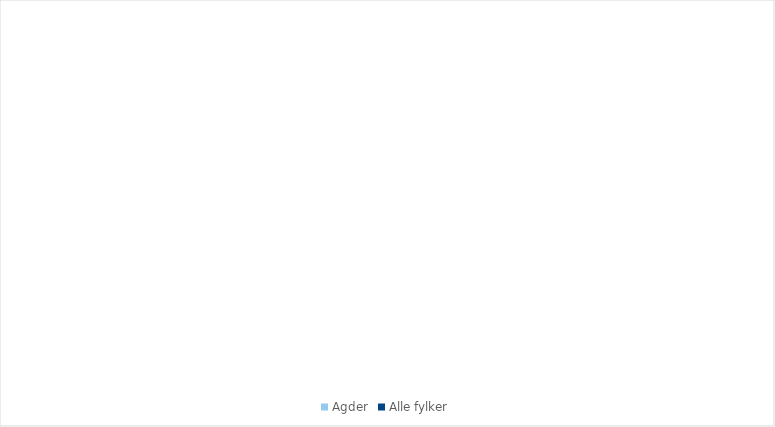
| Category | Agder | Alle fylker |
|---|---|---|
| 1.1 Landbruk | 0.694 | 0.814 |
| 1.2 Fiske/oppdrett | 0 | 1.732 |
| 2.1 Primærforedlingsindustri | 2.073 | 2.443 |
| 2.2 Olje/gass, bergverk | 0 | 2.052 |
| 2.3 Teknologiindustri | 3.727 | 1.926 |
| 2.4 Annen industri | 6.972 | 3.764 |
| 3.1 Bygg/anlegg, energi, vann/
avløp, eiendom | 25.052 | 21.135 |
| 3.2 Transport- og distribusjonstjenester | 4.618 | 4.233 |
| 4.1 Kunnskapsintensiv forretningsmessig tjenesteyting (KIFT) | 10.302 | 16.953 |
| 4.2 Varehandel | 9.585 | 9.688 |
| 4.3 Overnatting og servering | 1.568 | 1.718 |
| 4.4 Annen privat dominert tjenesteyting | 4.838 | 5.772 |
| 5.1 Offentlig admistrasjon og forsvar | 7.208 | 8.035 |
| 5.2 Undervisning | 7.54 | 6.39 |
| 5.3 Helse- og omsorgstjenester | 15.822 | 13.343 |